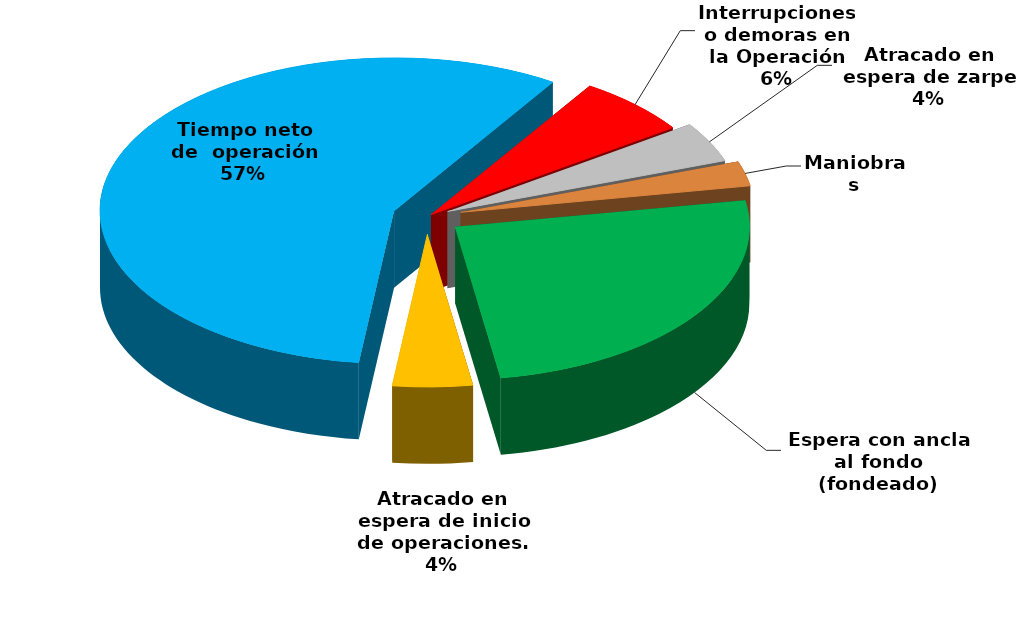
| Category | Series 0 |
|---|---|
| Espera con ancla al fondo (fondeado) | 45979.074 |
| Atracado en espera de inicio de operaciones. | 7975.922 |
| Tiempo neto de  operación | 103866.227 |
| Interrupciones o demoras en la Operación | 11433.62 |
| Atracado en espera de zarpe | 7711.069 |
| Maniobras | 4762.5 |